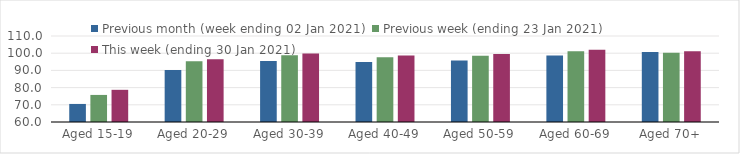
| Category | Previous month (week ending 02 Jan 2021) | Previous week (ending 23 Jan 2021) | This week (ending 30 Jan 2021) |
|---|---|---|---|
| Aged 15-19 | 70.5 | 75.74 | 78.71 |
| Aged 20-29 | 90.21 | 95.38 | 96.44 |
| Aged 30-39 | 95.52 | 98.84 | 99.85 |
| Aged 40-49 | 94.9 | 97.63 | 98.71 |
| Aged 50-59 | 95.8 | 98.57 | 99.51 |
| Aged 60-69 | 98.69 | 101.08 | 102.03 |
| Aged 70+ | 100.67 | 100.22 | 101.19 |